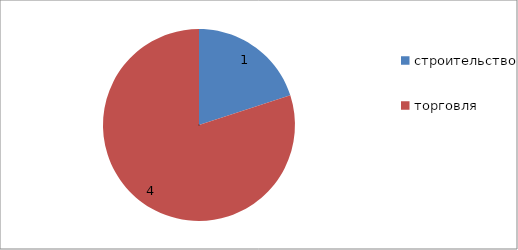
| Category | Series 0 |
|---|---|
| строительство | 1 |
| торговля | 4 |